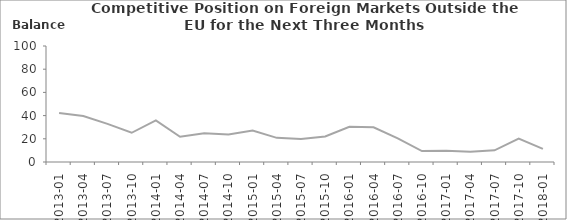
| Category | Balance |
|---|---|
| 2013-01 | 42.3 |
| 2013-04 | 39.7 |
| 2013-07 | 32.9 |
| 2013-10 | 25.2 |
| 2014-01 | 35.9 |
| 2014-04 | 21.7 |
| 2014-07 | 24.8 |
| 2014-10 | 23.7 |
| 2015-01 | 27.2 |
| 2015-04 | 20.8 |
| 2015-07 | 19.9 |
| 2015-10 | 22 |
| 2016-01 | 30.4 |
| 2016-04 | 29.9 |
| 2016-07 | 20.3 |
| 2016-10 | 9.4 |
| 2017-01 | 9.8 |
| 2017-04 | 8.9 |
| 2017-07 | 10.1 |
| 2017-10 | 20.2 |
| 2018-01 | 11.3 |